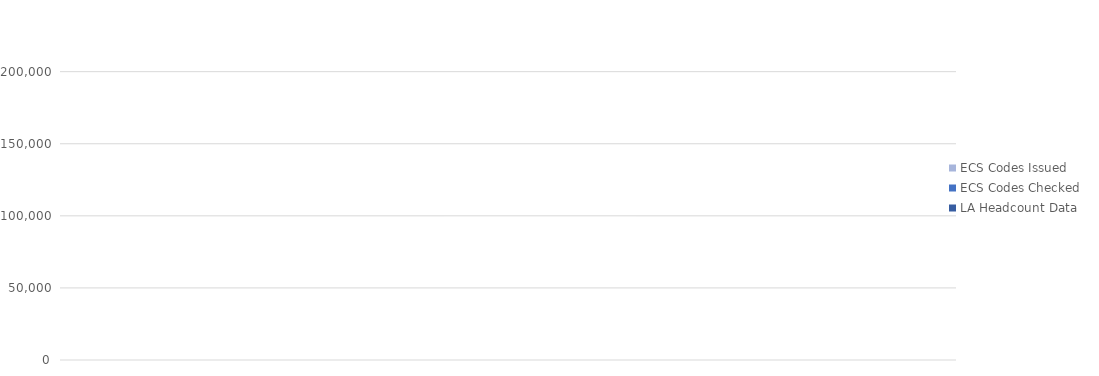
| Category | LA Headcount Data | ECS Codes Checked | ECS Codes Issued |
|---|---|---|---|
| 0 | 0 | 0 | 0 |